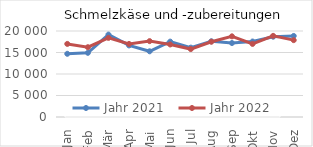
| Category | Jahr 2021 | Jahr 2022 |
|---|---|---|
| Jan | 14698.882 | 16998.18 |
| Feb | 14921.53 | 16227.912 |
| Mär | 19168.824 | 18398.223 |
| Apr | 16642.908 | 16990.404 |
| Mai | 15278.134 | 17643.947 |
| Jun | 17529.486 | 16867.96 |
| Jul | 16129.385 | 15794.732 |
| Aug | 17613.122 | 17501.983 |
| Sep | 17201.515 | 18760.121 |
| Okt | 17553.683 | 16993.541 |
| Nov | 18676.509 | 18868.081 |
| Dez | 18847.884 | 17871.851 |